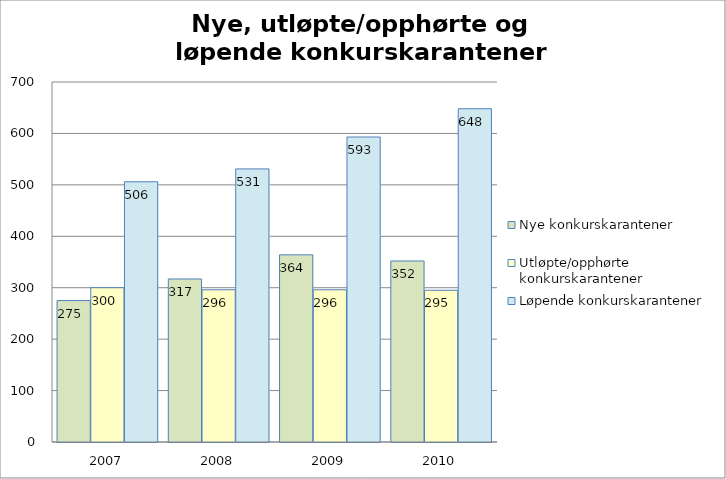
| Category | Nye konkurskarantener | Utløpte/opphørte konkurskarantener | Løpende konkurskarantener |
|---|---|---|---|
| 2007.0 | 275 | 300 | 506 |
| 2008.0 | 317 | 296 | 531 |
| 2009.0 | 364 | 296 | 593 |
| 2010.0 | 352 | 295 | 648 |